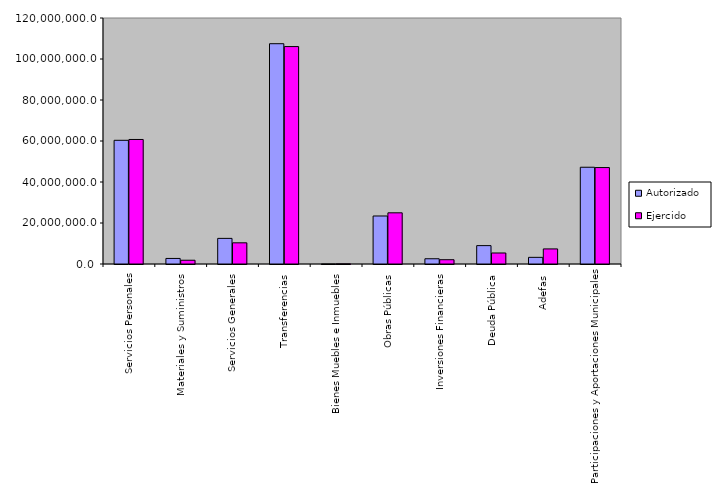
| Category | Autorizado | Ejercido |
|---|---|---|
| 0 | 60341463.1 | 60741628.2 |
| 1 | 2710247.7 | 1834481.2 |
| 2 | 12499675.9 | 10332535.7 |
| 3 | 107454281.3 | 106059839.7 |
| 4 | 4331.4 | 82350.4 |
| 5 | 23420419.6 | 24962952.1 |
| 6 | 2560133.5 | 2089662.8 |
| 7 | 8965665.2 | 5366241.9 |
| 8 | 3243691 | 7356124.3 |
| 9 | 47198300.6 | 47044937 |